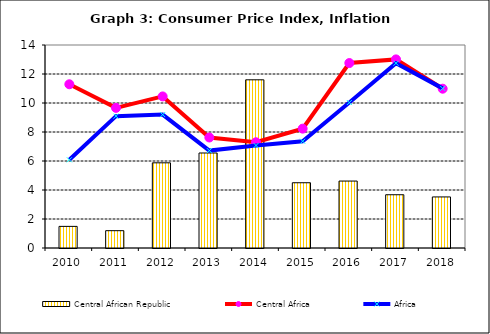
| Category | Central African Republic |
|---|---|
| 2010.0 | 1.491 |
| 2011.0 | 1.195 |
| 2012.0 | 5.874 |
| 2013.0 | 6.552 |
| 2014.0 | 11.6 |
| 2015.0 | 4.5 |
| 2016.0 | 4.617 |
| 2017.0 | 3.673 |
| 2018.0 | 3.523 |